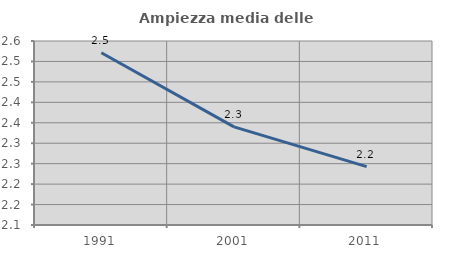
| Category | Ampiezza media delle famiglie |
|---|---|
| 1991.0 | 2.521 |
| 2001.0 | 2.34 |
| 2011.0 | 2.243 |